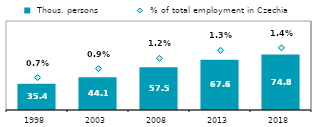
| Category |  Thous. persons |
|---|---|
| 1998.0 | 35.407 |
| 2003.0 | 44.06 |
| 2008.0 | 57.514 |
| 2013.0 | 67.631 |
| 2018.0 | 74.838 |